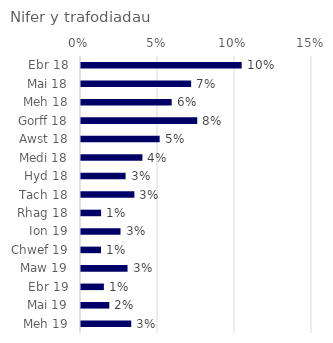
| Category | Nifer y trafodiadau |
|---|---|
| Ebr 18 | 0.104 |
| Mai 18 | 0.072 |
| Meh 18 | 0.059 |
| Gorff 18 | 0.075 |
| Awst 18 | 0.051 |
| Medi 18 | 0.04 |
| Hyd 18 | 0.029 |
| Tach 18 | 0.035 |
| Rhag 18 | 0.013 |
| Ion 19 | 0.026 |
| Chwef 19 | 0.013 |
| Maw 19 | 0.03 |
| Ebr 19 | 0.015 |
| Mai 19 | 0.018 |
| Meh 19 | 0.033 |